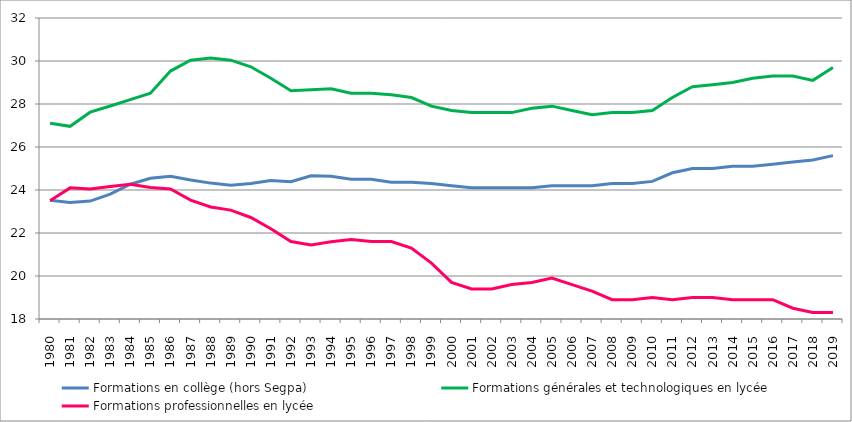
| Category | Formations en collège (hors Segpa) | Formations générales et technologiques en lycée | Formations professionnelles en lycée |
|---|---|---|---|
| 1980 | 23.523 | 27.1 | 23.5 |
| 1981 | 23.423 | 26.961 | 24.099 |
| 1982 | 23.485 | 27.62 | 24.043 |
| 1983 | 23.805 | 27.908 | 24.165 |
| 1984 | 24.267 | 28.202 | 24.266 |
| 1985 | 24.546 | 28.5 | 24.121 |
| 1986 | 24.644 | 29.532 | 24.044 |
| 1987 | 24.462 | 30.038 | 23.532 |
| 1988 | 24.321 | 30.138 | 23.21 |
| 1989 | 24.221 | 30.038 | 23.066 |
| 1990 | 24.3 | 29.732 | 22.721 |
| 1991 | 24.441 | 29.196 | 22.199 |
| 1992 | 24.382 | 28.62 | 21.6 |
| 1993 | 24.662 | 28.667 | 21.444 |
| 1994 | 24.641 | 28.708 | 21.589 |
| 1995 | 24.5 | 28.5 | 21.7 |
| 1996 | 24.5 | 28.5 | 21.6 |
| 1997 | 24.362 | 28.431 | 21.6 |
| 1998 | 24.362 | 28.3 | 21.3 |
| 1999 | 24.3 | 27.9 | 20.6 |
| 2000 | 24.2 | 27.7 | 19.7 |
| 2001 | 24.1 | 27.6 | 19.4 |
| 2002 | 24.1 | 27.6 | 19.4 |
| 2003 | 24.1 | 27.6 | 19.6 |
| 2004 | 24.1 | 27.8 | 19.7 |
| 2005 | 24.2 | 27.9 | 19.9 |
| 2006 | 24.2 | 27.7 | 19.6 |
| 2007 | 24.2 | 27.5 | 19.3 |
| 2008 | 24.3 | 27.6 | 18.9 |
| 2009 | 24.3 | 27.6 | 18.9 |
| 2010 | 24.4 | 27.7 | 19 |
| 2011 | 24.8 | 28.3 | 18.9 |
| 2012 | 25 | 28.8 | 19 |
| 2013 | 25 | 28.9 | 19 |
| 2014 | 25.1 | 29 | 18.9 |
| 2015 | 25.1 | 29.2 | 18.9 |
| 2016 | 25.2 | 29.3 | 18.9 |
| 2017 | 25.3 | 29.3 | 18.5 |
| 2018 | 25.4 | 29.1 | 18.3 |
| 2019 | 25.6 | 29.7 | 18.3 |